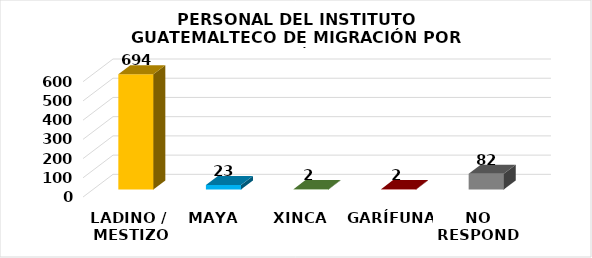
| Category | Series 0 |
|---|---|
| LADINO /
 MESTIZO | 694 |
| MAYA | 23 |
| XINCA | 2 |
| GARÍFUNA | 2 |
| NO RESPONDE | 82 |